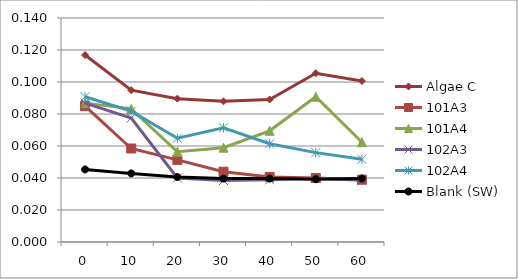
| Category | Algae C | 101A3 | 101A4 | 102A3 | 102A4 | Blank (SW) |
|---|---|---|---|---|---|---|
| 0.0 | 0.117 | 0.085 | 0.087 | 0.087 | 0.091 | 0.045 |
| 10.0 | 0.095 | 0.058 | 0.083 | 0.078 | 0.082 | 0.043 |
| 20.0 | 0.09 | 0.051 | 0.056 | 0.04 | 0.065 | 0.041 |
| 30.0 | 0.088 | 0.044 | 0.059 | 0.038 | 0.071 | 0.04 |
| 40.0 | 0.089 | 0.041 | 0.069 | 0.039 | 0.061 | 0.04 |
| 50.0 | 0.106 | 0.04 | 0.091 | 0.04 | 0.056 | 0.039 |
| 60.0 | 0.101 | 0.039 | 0.062 | 0.039 | 0.052 | 0.04 |